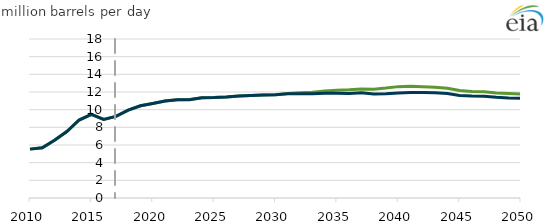
| Category | Mean ANWR | AEO2018 Reference  |
|---|---|---|
| 2010.0 | 5.533 | 5.533 |
| 2011.0 | 5.697 | 5.697 |
| 2012.0 | 6.542 | 6.542 |
| 2013.0 | 7.531 | 7.531 |
| 2014.0 | 8.828 | 8.828 |
| 2015.0 | 9.465 | 9.465 |
| 2016.0 | 8.904 | 8.904 |
| 2017.0 | 9.243 | 9.243 |
| 2018.0 | 9.943 | 9.946 |
| 2019.0 | 10.447 | 10.437 |
| 2020.0 | 10.7 | 10.702 |
| 2021.0 | 10.972 | 10.976 |
| 2022.0 | 11.109 | 11.11 |
| 2023.0 | 11.14 | 11.134 |
| 2024.0 | 11.355 | 11.356 |
| 2025.0 | 11.376 | 11.381 |
| 2026.0 | 11.432 | 11.442 |
| 2027.0 | 11.539 | 11.546 |
| 2028.0 | 11.605 | 11.61 |
| 2029.0 | 11.665 | 11.666 |
| 2030.0 | 11.692 | 11.696 |
| 2031.0 | 11.842 | 11.814 |
| 2032.0 | 11.912 | 11.815 |
| 2033.0 | 11.975 | 11.794 |
| 2034.0 | 12.121 | 11.871 |
| 2035.0 | 12.185 | 11.852 |
| 2036.0 | 12.246 | 11.825 |
| 2037.0 | 12.35 | 11.903 |
| 2038.0 | 12.322 | 11.765 |
| 2039.0 | 12.444 | 11.801 |
| 2040.0 | 12.608 | 11.899 |
| 2041.0 | 12.646 | 11.939 |
| 2042.0 | 12.592 | 11.946 |
| 2043.0 | 12.547 | 11.909 |
| 2044.0 | 12.417 | 11.826 |
| 2045.0 | 12.174 | 11.615 |
| 2046.0 | 12.067 | 11.539 |
| 2047.0 | 12.03 | 11.526 |
| 2048.0 | 11.897 | 11.399 |
| 2049.0 | 11.827 | 11.333 |
| 2050.0 | 11.778 | 11.301 |